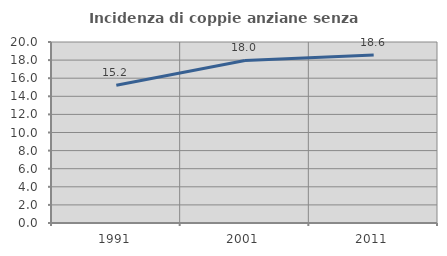
| Category | Incidenza di coppie anziane senza figli  |
|---|---|
| 1991.0 | 15.211 |
| 2001.0 | 17.964 |
| 2011.0 | 18.576 |